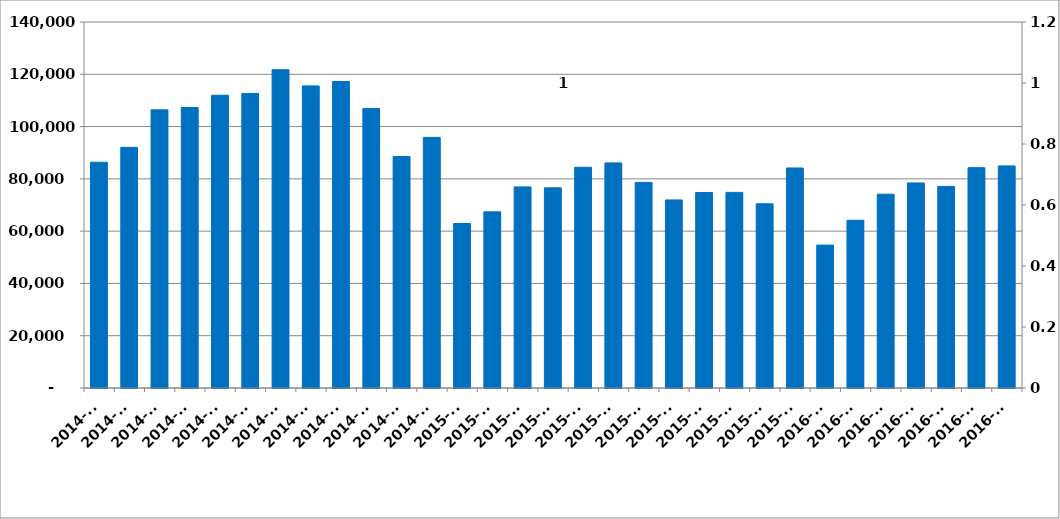
| Category | ფულადი გზავნილები სულ |
|---|---|
| 2014-01 | 86357.753 |
| 2014-02 | 92055.883 |
| 2014-03 | 106392.239 |
| 2014-04 | 107292.922 |
| 2014-05 | 111984.398 |
| 2014-06 | 112671.837 |
| 2014-07 | 121755.209 |
| 2014-08 | 115557.924 |
| 2014-09 | 117230.345 |
| 2014-10 | 106876.27 |
| 2014-11 | 88546.451 |
| 2014-12 | 95863.604 |
| 2015-01 | 62908.96 |
| 2015-02 | 67382.448 |
| 2015-03 | 76916.487 |
| 2015-04 | 76570.981 |
| 2015-05 | 84424.274 |
| 2015-06 | 86099.207 |
| 2015-07 | 78641.132 |
| 2015-08 | 71947.484 |
| 2015-09 | 74780.377 |
| 2015-10 | 74824.958 |
| 2015-11 | 70452.204 |
| 2015-12 | 84159.758 |
| 2016-01 | 54668.843 |
| 2016-02 | 64166.493 |
| 2016-03 | 74135.096 |
| 2016-04 | 78445.112 |
| 2016-05 | 77110.878 |
| 2016-06 | 84274.721 |
| 2016-07 | 84960.145 |